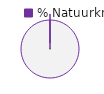
| Category | 7 - Natuurknap |
|---|---|
| 0 | 0 |
| 1 | 1 |